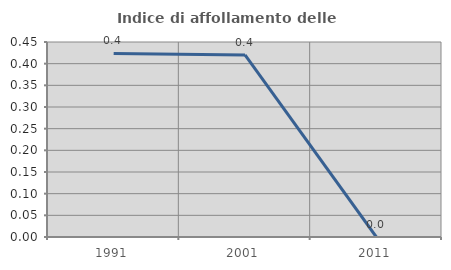
| Category | Indice di affollamento delle abitazioni  |
|---|---|
| 1991.0 | 0.424 |
| 2001.0 | 0.42 |
| 2011.0 | 0 |